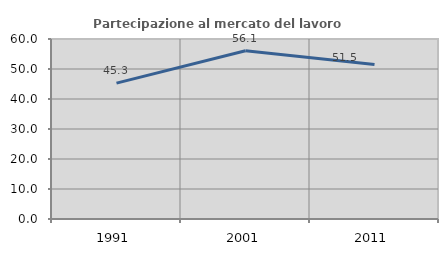
| Category | Partecipazione al mercato del lavoro  femminile |
|---|---|
| 1991.0 | 45.306 |
| 2001.0 | 56.077 |
| 2011.0 | 51.463 |